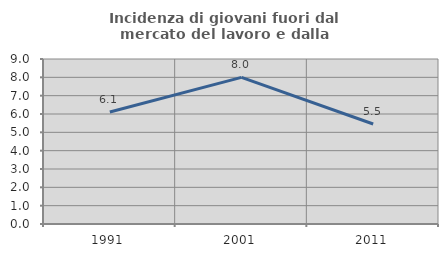
| Category | Incidenza di giovani fuori dal mercato del lavoro e dalla formazione  |
|---|---|
| 1991.0 | 6.111 |
| 2001.0 | 8 |
| 2011.0 | 5.455 |